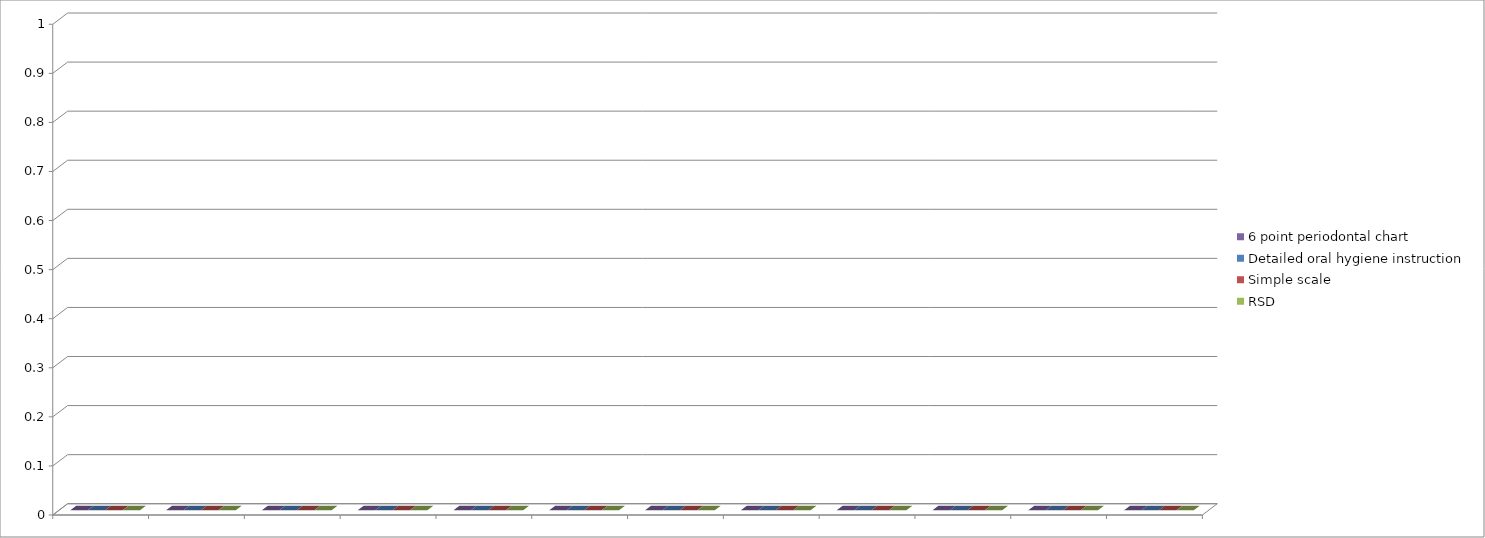
| Category | 6 point periodontal chart | Detailed oral hygiene instruction | Simple scale | RSD |
|---|---|---|---|---|
| 0 | 0 | 0 | 0 | 0 |
| 1 | 0 | 0 | 0 | 0 |
| 2 | 0 | 0 | 0 | 0 |
| 3 | 0 | 0 | 0 | 0 |
| 4 | 0 | 0 | 0 | 0 |
| 5 | 0 | 0 | 0 | 0 |
| 6 | 0 | 0 | 0 | 0 |
| 7 | 0 | 0 | 0 | 0 |
| 8 | 0 | 0 | 0 | 0 |
| 9 | 0 | 0 | 0 | 0 |
| 10 | 0 | 0 | 0 | 0 |
| 11 | 0 | 0 | 0 | 0 |